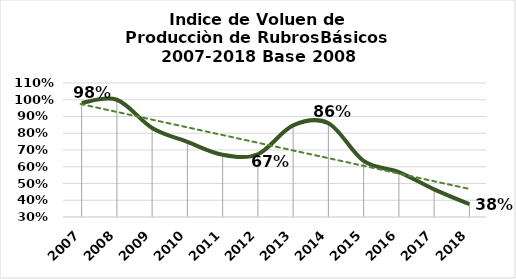
| Category | Indice Base 2008 |
|---|---|
| 2007.0 | 0.982 |
| 2008.0 | 1 |
| 2009.0 | 0.831 |
| 2010.0 | 0.748 |
| 2011.0 | 0.672 |
| 2012.0 | 0.675 |
| 2013.0 | 0.847 |
| 2014.0 | 0.86 |
| 2015.0 | 0.635 |
| 2016.0 | 0.569 |
| 2017.0 | 0.465 |
| 2018.0 | 0.376 |